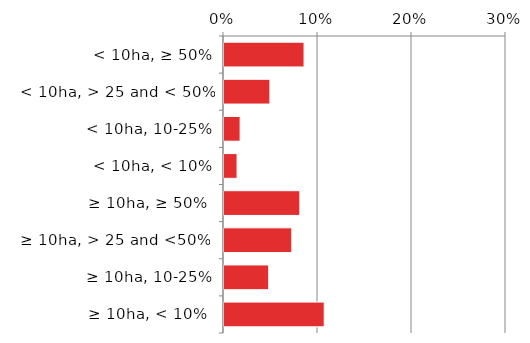
| Category | Native |
|---|---|
|  ≥ 10ha, < 10%  | 0.108 |
|   ≥ 10ha, 10-25% | 0.049 |
|   ≥ 10ha, > 25 and <50%  | 0.073 |
|   ≥ 10ha, ≥ 50%  | 0.082 |
|  < 10ha, < 10% | 0.015 |
|  < 10ha, 10-25% | 0.018 |
|  < 10ha, > 25 and < 50% | 0.05 |
|  < 10ha, ≥ 50% | 0.086 |